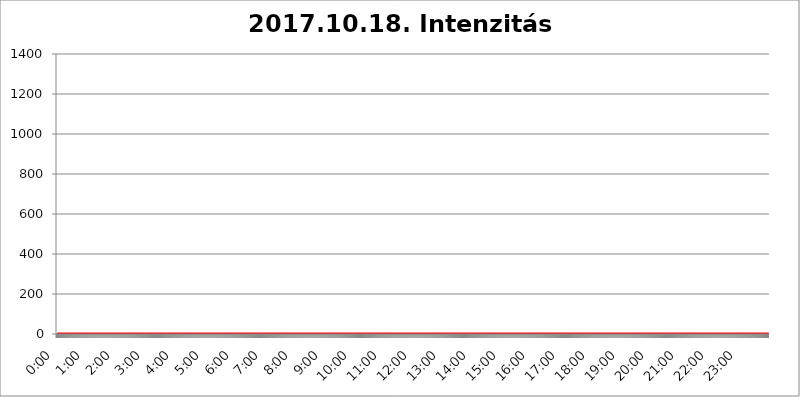
| Category | 2017.10.18. Intenzitás [W/m^2] |
|---|---|
| 0.0 | 0 |
| 0.0006944444444444445 | 0 |
| 0.001388888888888889 | 0 |
| 0.0020833333333333333 | 0 |
| 0.002777777777777778 | 0 |
| 0.003472222222222222 | 0 |
| 0.004166666666666667 | 0 |
| 0.004861111111111111 | 0 |
| 0.005555555555555556 | 0 |
| 0.0062499999999999995 | 0 |
| 0.006944444444444444 | 0 |
| 0.007638888888888889 | 0 |
| 0.008333333333333333 | 0 |
| 0.009027777777777779 | 0 |
| 0.009722222222222222 | 0 |
| 0.010416666666666666 | 0 |
| 0.011111111111111112 | 0 |
| 0.011805555555555555 | 0 |
| 0.012499999999999999 | 0 |
| 0.013194444444444444 | 0 |
| 0.013888888888888888 | 0 |
| 0.014583333333333332 | 0 |
| 0.015277777777777777 | 0 |
| 0.015972222222222224 | 0 |
| 0.016666666666666666 | 0 |
| 0.017361111111111112 | 0 |
| 0.018055555555555557 | 0 |
| 0.01875 | 0 |
| 0.019444444444444445 | 0 |
| 0.02013888888888889 | 0 |
| 0.020833333333333332 | 0 |
| 0.02152777777777778 | 0 |
| 0.022222222222222223 | 0 |
| 0.02291666666666667 | 0 |
| 0.02361111111111111 | 0 |
| 0.024305555555555556 | 0 |
| 0.024999999999999998 | 0 |
| 0.025694444444444447 | 0 |
| 0.02638888888888889 | 0 |
| 0.027083333333333334 | 0 |
| 0.027777777777777776 | 0 |
| 0.02847222222222222 | 0 |
| 0.029166666666666664 | 0 |
| 0.029861111111111113 | 0 |
| 0.030555555555555555 | 0 |
| 0.03125 | 0 |
| 0.03194444444444445 | 0 |
| 0.03263888888888889 | 0 |
| 0.03333333333333333 | 0 |
| 0.034027777777777775 | 0 |
| 0.034722222222222224 | 0 |
| 0.035416666666666666 | 0 |
| 0.036111111111111115 | 0 |
| 0.03680555555555556 | 0 |
| 0.0375 | 0 |
| 0.03819444444444444 | 0 |
| 0.03888888888888889 | 0 |
| 0.03958333333333333 | 0 |
| 0.04027777777777778 | 0 |
| 0.04097222222222222 | 0 |
| 0.041666666666666664 | 0 |
| 0.042361111111111106 | 0 |
| 0.04305555555555556 | 0 |
| 0.043750000000000004 | 0 |
| 0.044444444444444446 | 0 |
| 0.04513888888888889 | 0 |
| 0.04583333333333334 | 0 |
| 0.04652777777777778 | 0 |
| 0.04722222222222222 | 0 |
| 0.04791666666666666 | 0 |
| 0.04861111111111111 | 0 |
| 0.049305555555555554 | 0 |
| 0.049999999999999996 | 0 |
| 0.05069444444444445 | 0 |
| 0.051388888888888894 | 0 |
| 0.052083333333333336 | 0 |
| 0.05277777777777778 | 0 |
| 0.05347222222222222 | 0 |
| 0.05416666666666667 | 0 |
| 0.05486111111111111 | 0 |
| 0.05555555555555555 | 0 |
| 0.05625 | 0 |
| 0.05694444444444444 | 0 |
| 0.057638888888888885 | 0 |
| 0.05833333333333333 | 0 |
| 0.05902777777777778 | 0 |
| 0.059722222222222225 | 0 |
| 0.06041666666666667 | 0 |
| 0.061111111111111116 | 0 |
| 0.06180555555555556 | 0 |
| 0.0625 | 0 |
| 0.06319444444444444 | 0 |
| 0.06388888888888888 | 0 |
| 0.06458333333333334 | 0 |
| 0.06527777777777778 | 0 |
| 0.06597222222222222 | 0 |
| 0.06666666666666667 | 0 |
| 0.06736111111111111 | 0 |
| 0.06805555555555555 | 0 |
| 0.06874999999999999 | 0 |
| 0.06944444444444443 | 0 |
| 0.07013888888888889 | 0 |
| 0.07083333333333333 | 0 |
| 0.07152777777777779 | 0 |
| 0.07222222222222223 | 0 |
| 0.07291666666666667 | 0 |
| 0.07361111111111111 | 0 |
| 0.07430555555555556 | 0 |
| 0.075 | 0 |
| 0.07569444444444444 | 0 |
| 0.0763888888888889 | 0 |
| 0.07708333333333334 | 0 |
| 0.07777777777777778 | 0 |
| 0.07847222222222222 | 0 |
| 0.07916666666666666 | 0 |
| 0.0798611111111111 | 0 |
| 0.08055555555555556 | 0 |
| 0.08125 | 0 |
| 0.08194444444444444 | 0 |
| 0.08263888888888889 | 0 |
| 0.08333333333333333 | 0 |
| 0.08402777777777777 | 0 |
| 0.08472222222222221 | 0 |
| 0.08541666666666665 | 0 |
| 0.08611111111111112 | 0 |
| 0.08680555555555557 | 0 |
| 0.08750000000000001 | 0 |
| 0.08819444444444445 | 0 |
| 0.08888888888888889 | 0 |
| 0.08958333333333333 | 0 |
| 0.09027777777777778 | 0 |
| 0.09097222222222222 | 0 |
| 0.09166666666666667 | 0 |
| 0.09236111111111112 | 0 |
| 0.09305555555555556 | 0 |
| 0.09375 | 0 |
| 0.09444444444444444 | 0 |
| 0.09513888888888888 | 0 |
| 0.09583333333333333 | 0 |
| 0.09652777777777777 | 0 |
| 0.09722222222222222 | 0 |
| 0.09791666666666667 | 0 |
| 0.09861111111111111 | 0 |
| 0.09930555555555555 | 0 |
| 0.09999999999999999 | 0 |
| 0.10069444444444443 | 0 |
| 0.1013888888888889 | 0 |
| 0.10208333333333335 | 0 |
| 0.10277777777777779 | 0 |
| 0.10347222222222223 | 0 |
| 0.10416666666666667 | 0 |
| 0.10486111111111111 | 0 |
| 0.10555555555555556 | 0 |
| 0.10625 | 0 |
| 0.10694444444444444 | 0 |
| 0.1076388888888889 | 0 |
| 0.10833333333333334 | 0 |
| 0.10902777777777778 | 0 |
| 0.10972222222222222 | 0 |
| 0.1111111111111111 | 0 |
| 0.11180555555555556 | 0 |
| 0.11180555555555556 | 0 |
| 0.1125 | 0 |
| 0.11319444444444444 | 0 |
| 0.11388888888888889 | 0 |
| 0.11458333333333333 | 0 |
| 0.11527777777777777 | 0 |
| 0.11597222222222221 | 0 |
| 0.11666666666666665 | 0 |
| 0.1173611111111111 | 0 |
| 0.11805555555555557 | 0 |
| 0.11944444444444445 | 0 |
| 0.12013888888888889 | 0 |
| 0.12083333333333333 | 0 |
| 0.12152777777777778 | 0 |
| 0.12222222222222223 | 0 |
| 0.12291666666666667 | 0 |
| 0.12291666666666667 | 0 |
| 0.12361111111111112 | 0 |
| 0.12430555555555556 | 0 |
| 0.125 | 0 |
| 0.12569444444444444 | 0 |
| 0.12638888888888888 | 0 |
| 0.12708333333333333 | 0 |
| 0.16875 | 0 |
| 0.12847222222222224 | 0 |
| 0.12916666666666668 | 0 |
| 0.12986111111111112 | 0 |
| 0.13055555555555556 | 0 |
| 0.13125 | 0 |
| 0.13194444444444445 | 0 |
| 0.1326388888888889 | 0 |
| 0.13333333333333333 | 0 |
| 0.13402777777777777 | 0 |
| 0.13402777777777777 | 0 |
| 0.13472222222222222 | 0 |
| 0.13541666666666666 | 0 |
| 0.1361111111111111 | 0 |
| 0.13749999999999998 | 0 |
| 0.13819444444444443 | 0 |
| 0.1388888888888889 | 0 |
| 0.13958333333333334 | 0 |
| 0.14027777777777778 | 0 |
| 0.14097222222222222 | 0 |
| 0.14166666666666666 | 0 |
| 0.1423611111111111 | 0 |
| 0.14305555555555557 | 0 |
| 0.14375000000000002 | 0 |
| 0.14444444444444446 | 0 |
| 0.1451388888888889 | 0 |
| 0.1451388888888889 | 0 |
| 0.14652777777777778 | 0 |
| 0.14722222222222223 | 0 |
| 0.14791666666666667 | 0 |
| 0.1486111111111111 | 0 |
| 0.14930555555555555 | 0 |
| 0.15 | 0 |
| 0.15069444444444444 | 0 |
| 0.15138888888888888 | 0 |
| 0.15208333333333332 | 0 |
| 0.15277777777777776 | 0 |
| 0.15347222222222223 | 0 |
| 0.15416666666666667 | 0 |
| 0.15486111111111112 | 0 |
| 0.15555555555555556 | 0 |
| 0.15625 | 0 |
| 0.15694444444444444 | 0 |
| 0.15763888888888888 | 0 |
| 0.15833333333333333 | 0 |
| 0.15902777777777777 | 0 |
| 0.15972222222222224 | 0 |
| 0.16041666666666668 | 0 |
| 0.16111111111111112 | 0 |
| 0.16180555555555556 | 0 |
| 0.1625 | 0 |
| 0.16319444444444445 | 0 |
| 0.1638888888888889 | 0 |
| 0.16458333333333333 | 0 |
| 0.16527777777777777 | 0 |
| 0.16597222222222222 | 0 |
| 0.16666666666666666 | 0 |
| 0.1673611111111111 | 0 |
| 0.16805555555555554 | 0 |
| 0.16874999999999998 | 0 |
| 0.16944444444444443 | 0 |
| 0.17013888888888887 | 0 |
| 0.1708333333333333 | 0 |
| 0.17152777777777775 | 0 |
| 0.17222222222222225 | 0 |
| 0.1729166666666667 | 0 |
| 0.17361111111111113 | 0 |
| 0.17430555555555557 | 0 |
| 0.17500000000000002 | 0 |
| 0.17569444444444446 | 0 |
| 0.1763888888888889 | 0 |
| 0.17708333333333334 | 0 |
| 0.17777777777777778 | 0 |
| 0.17847222222222223 | 0 |
| 0.17916666666666667 | 0 |
| 0.1798611111111111 | 0 |
| 0.18055555555555555 | 0 |
| 0.18125 | 0 |
| 0.18194444444444444 | 0 |
| 0.1826388888888889 | 0 |
| 0.18333333333333335 | 0 |
| 0.1840277777777778 | 0 |
| 0.18472222222222223 | 0 |
| 0.18541666666666667 | 0 |
| 0.18611111111111112 | 0 |
| 0.18680555555555556 | 0 |
| 0.1875 | 0 |
| 0.18819444444444444 | 0 |
| 0.18888888888888888 | 0 |
| 0.18958333333333333 | 0 |
| 0.19027777777777777 | 0 |
| 0.1909722222222222 | 0 |
| 0.19166666666666665 | 0 |
| 0.19236111111111112 | 0 |
| 0.19305555555555554 | 0 |
| 0.19375 | 0 |
| 0.19444444444444445 | 0 |
| 0.1951388888888889 | 0 |
| 0.19583333333333333 | 0 |
| 0.19652777777777777 | 0 |
| 0.19722222222222222 | 0 |
| 0.19791666666666666 | 0 |
| 0.1986111111111111 | 0 |
| 0.19930555555555554 | 0 |
| 0.19999999999999998 | 0 |
| 0.20069444444444443 | 0 |
| 0.20138888888888887 | 0 |
| 0.2020833333333333 | 0 |
| 0.2027777777777778 | 0 |
| 0.2034722222222222 | 0 |
| 0.2041666666666667 | 0 |
| 0.20486111111111113 | 0 |
| 0.20555555555555557 | 0 |
| 0.20625000000000002 | 0 |
| 0.20694444444444446 | 0 |
| 0.2076388888888889 | 0 |
| 0.20833333333333334 | 0 |
| 0.20902777777777778 | 0 |
| 0.20972222222222223 | 0 |
| 0.21041666666666667 | 0 |
| 0.2111111111111111 | 0 |
| 0.21180555555555555 | 0 |
| 0.2125 | 0 |
| 0.21319444444444444 | 0 |
| 0.2138888888888889 | 0 |
| 0.21458333333333335 | 0 |
| 0.2152777777777778 | 0 |
| 0.21597222222222223 | 0 |
| 0.21666666666666667 | 0 |
| 0.21736111111111112 | 0 |
| 0.21805555555555556 | 0 |
| 0.21875 | 0 |
| 0.21944444444444444 | 0 |
| 0.22013888888888888 | 0 |
| 0.22083333333333333 | 0 |
| 0.22152777777777777 | 0 |
| 0.2222222222222222 | 0 |
| 0.22291666666666665 | 0 |
| 0.2236111111111111 | 0 |
| 0.22430555555555556 | 0 |
| 0.225 | 0 |
| 0.22569444444444445 | 0 |
| 0.2263888888888889 | 0 |
| 0.22708333333333333 | 0 |
| 0.22777777777777777 | 0 |
| 0.22847222222222222 | 0 |
| 0.22916666666666666 | 0 |
| 0.2298611111111111 | 0 |
| 0.23055555555555554 | 0 |
| 0.23124999999999998 | 0 |
| 0.23194444444444443 | 0 |
| 0.23263888888888887 | 0 |
| 0.2333333333333333 | 0 |
| 0.2340277777777778 | 0 |
| 0.2347222222222222 | 0 |
| 0.2354166666666667 | 0 |
| 0.23611111111111113 | 0 |
| 0.23680555555555557 | 0 |
| 0.23750000000000002 | 0 |
| 0.23819444444444446 | 0 |
| 0.2388888888888889 | 0 |
| 0.23958333333333334 | 0 |
| 0.24027777777777778 | 0 |
| 0.24097222222222223 | 0 |
| 0.24166666666666667 | 0 |
| 0.2423611111111111 | 0 |
| 0.24305555555555555 | 0 |
| 0.24375 | 0 |
| 0.24444444444444446 | 0 |
| 0.24513888888888888 | 0 |
| 0.24583333333333335 | 0 |
| 0.2465277777777778 | 0 |
| 0.24722222222222223 | 0 |
| 0.24791666666666667 | 0 |
| 0.24861111111111112 | 0 |
| 0.24930555555555556 | 0 |
| 0.25 | 0 |
| 0.25069444444444444 | 0 |
| 0.2513888888888889 | 0 |
| 0.2520833333333333 | 0 |
| 0.25277777777777777 | 0 |
| 0.2534722222222222 | 0 |
| 0.25416666666666665 | 0 |
| 0.2548611111111111 | 0 |
| 0.2555555555555556 | 0 |
| 0.25625000000000003 | 0 |
| 0.2569444444444445 | 0 |
| 0.2576388888888889 | 0 |
| 0.25833333333333336 | 0 |
| 0.2590277777777778 | 0 |
| 0.25972222222222224 | 0 |
| 0.2604166666666667 | 0 |
| 0.2611111111111111 | 0 |
| 0.26180555555555557 | 0 |
| 0.2625 | 0 |
| 0.26319444444444445 | 0 |
| 0.2638888888888889 | 0 |
| 0.26458333333333334 | 0 |
| 0.2652777777777778 | 0 |
| 0.2659722222222222 | 0 |
| 0.26666666666666666 | 0 |
| 0.2673611111111111 | 0 |
| 0.26805555555555555 | 0 |
| 0.26875 | 0 |
| 0.26944444444444443 | 0 |
| 0.2701388888888889 | 0 |
| 0.2708333333333333 | 0 |
| 0.27152777777777776 | 0 |
| 0.2722222222222222 | 0 |
| 0.27291666666666664 | 0 |
| 0.2736111111111111 | 0 |
| 0.2743055555555555 | 0 |
| 0.27499999999999997 | 0 |
| 0.27569444444444446 | 0 |
| 0.27638888888888885 | 0 |
| 0.27708333333333335 | 0 |
| 0.2777777777777778 | 0 |
| 0.27847222222222223 | 0 |
| 0.2791666666666667 | 0 |
| 0.2798611111111111 | 0 |
| 0.28055555555555556 | 0 |
| 0.28125 | 0 |
| 0.28194444444444444 | 0 |
| 0.2826388888888889 | 0 |
| 0.2833333333333333 | 0 |
| 0.28402777777777777 | 0 |
| 0.2847222222222222 | 0 |
| 0.28541666666666665 | 0 |
| 0.28611111111111115 | 0 |
| 0.28680555555555554 | 0 |
| 0.28750000000000003 | 0 |
| 0.2881944444444445 | 0 |
| 0.2888888888888889 | 0 |
| 0.28958333333333336 | 0 |
| 0.2902777777777778 | 0 |
| 0.29097222222222224 | 0 |
| 0.2916666666666667 | 0 |
| 0.2923611111111111 | 0 |
| 0.29305555555555557 | 0 |
| 0.29375 | 0 |
| 0.29444444444444445 | 0 |
| 0.2951388888888889 | 0 |
| 0.29583333333333334 | 0 |
| 0.2965277777777778 | 0 |
| 0.2972222222222222 | 0 |
| 0.29791666666666666 | 0 |
| 0.2986111111111111 | 0 |
| 0.29930555555555555 | 0 |
| 0.3 | 0 |
| 0.30069444444444443 | 0 |
| 0.3013888888888889 | 0 |
| 0.3020833333333333 | 0 |
| 0.30277777777777776 | 0 |
| 0.3034722222222222 | 0 |
| 0.30416666666666664 | 0 |
| 0.3048611111111111 | 0 |
| 0.3055555555555555 | 0 |
| 0.30624999999999997 | 0 |
| 0.3069444444444444 | 0 |
| 0.3076388888888889 | 0 |
| 0.30833333333333335 | 0 |
| 0.3090277777777778 | 0 |
| 0.30972222222222223 | 0 |
| 0.3104166666666667 | 0 |
| 0.3111111111111111 | 0 |
| 0.31180555555555556 | 0 |
| 0.3125 | 0 |
| 0.31319444444444444 | 0 |
| 0.3138888888888889 | 0 |
| 0.3145833333333333 | 0 |
| 0.31527777777777777 | 0 |
| 0.3159722222222222 | 0 |
| 0.31666666666666665 | 0 |
| 0.31736111111111115 | 0 |
| 0.31805555555555554 | 0 |
| 0.31875000000000003 | 0 |
| 0.3194444444444445 | 0 |
| 0.3201388888888889 | 0 |
| 0.32083333333333336 | 0 |
| 0.3215277777777778 | 0 |
| 0.32222222222222224 | 0 |
| 0.3229166666666667 | 0 |
| 0.3236111111111111 | 0 |
| 0.32430555555555557 | 0 |
| 0.325 | 0 |
| 0.32569444444444445 | 0 |
| 0.3263888888888889 | 0 |
| 0.32708333333333334 | 0 |
| 0.3277777777777778 | 0 |
| 0.3284722222222222 | 0 |
| 0.32916666666666666 | 0 |
| 0.3298611111111111 | 0 |
| 0.33055555555555555 | 0 |
| 0.33125 | 0 |
| 0.33194444444444443 | 0 |
| 0.3326388888888889 | 0 |
| 0.3333333333333333 | 0 |
| 0.3340277777777778 | 0 |
| 0.3347222222222222 | 0 |
| 0.3354166666666667 | 0 |
| 0.3361111111111111 | 0 |
| 0.3368055555555556 | 0 |
| 0.33749999999999997 | 0 |
| 0.33819444444444446 | 0 |
| 0.33888888888888885 | 0 |
| 0.33958333333333335 | 0 |
| 0.34027777777777773 | 0 |
| 0.34097222222222223 | 0 |
| 0.3416666666666666 | 0 |
| 0.3423611111111111 | 0 |
| 0.3430555555555555 | 0 |
| 0.34375 | 0 |
| 0.3444444444444445 | 0 |
| 0.3451388888888889 | 0 |
| 0.3458333333333334 | 0 |
| 0.34652777777777777 | 0 |
| 0.34722222222222227 | 0 |
| 0.34791666666666665 | 0 |
| 0.34861111111111115 | 0 |
| 0.34930555555555554 | 0 |
| 0.35000000000000003 | 0 |
| 0.3506944444444444 | 0 |
| 0.3513888888888889 | 0 |
| 0.3520833333333333 | 0 |
| 0.3527777777777778 | 0 |
| 0.3534722222222222 | 0 |
| 0.3541666666666667 | 0 |
| 0.3548611111111111 | 0 |
| 0.35555555555555557 | 0 |
| 0.35625 | 0 |
| 0.35694444444444445 | 0 |
| 0.3576388888888889 | 0 |
| 0.35833333333333334 | 0 |
| 0.3590277777777778 | 0 |
| 0.3597222222222222 | 0 |
| 0.36041666666666666 | 0 |
| 0.3611111111111111 | 0 |
| 0.36180555555555555 | 0 |
| 0.3625 | 0 |
| 0.36319444444444443 | 0 |
| 0.3638888888888889 | 0 |
| 0.3645833333333333 | 0 |
| 0.3652777777777778 | 0 |
| 0.3659722222222222 | 0 |
| 0.3666666666666667 | 0 |
| 0.3673611111111111 | 0 |
| 0.3680555555555556 | 0 |
| 0.36874999999999997 | 0 |
| 0.36944444444444446 | 0 |
| 0.37013888888888885 | 0 |
| 0.37083333333333335 | 0 |
| 0.37152777777777773 | 0 |
| 0.37222222222222223 | 0 |
| 0.3729166666666666 | 0 |
| 0.3736111111111111 | 0 |
| 0.3743055555555555 | 0 |
| 0.375 | 0 |
| 0.3756944444444445 | 0 |
| 0.3763888888888889 | 0 |
| 0.3770833333333334 | 0 |
| 0.37777777777777777 | 0 |
| 0.37847222222222227 | 0 |
| 0.37916666666666665 | 0 |
| 0.37986111111111115 | 0 |
| 0.38055555555555554 | 0 |
| 0.38125000000000003 | 0 |
| 0.3819444444444444 | 0 |
| 0.3826388888888889 | 0 |
| 0.3833333333333333 | 0 |
| 0.3840277777777778 | 0 |
| 0.3847222222222222 | 0 |
| 0.3854166666666667 | 0 |
| 0.3861111111111111 | 0 |
| 0.38680555555555557 | 0 |
| 0.3875 | 0 |
| 0.38819444444444445 | 0 |
| 0.3888888888888889 | 0 |
| 0.38958333333333334 | 0 |
| 0.3902777777777778 | 0 |
| 0.3909722222222222 | 0 |
| 0.39166666666666666 | 0 |
| 0.3923611111111111 | 0 |
| 0.39305555555555555 | 0 |
| 0.39375 | 0 |
| 0.39444444444444443 | 0 |
| 0.3951388888888889 | 0 |
| 0.3958333333333333 | 0 |
| 0.3965277777777778 | 0 |
| 0.3972222222222222 | 0 |
| 0.3979166666666667 | 0 |
| 0.3986111111111111 | 0 |
| 0.3993055555555556 | 0 |
| 0.39999999999999997 | 0 |
| 0.40069444444444446 | 0 |
| 0.40138888888888885 | 0 |
| 0.40208333333333335 | 0 |
| 0.40277777777777773 | 0 |
| 0.40347222222222223 | 0 |
| 0.4041666666666666 | 0 |
| 0.4048611111111111 | 0 |
| 0.4055555555555555 | 0 |
| 0.40625 | 0 |
| 0.4069444444444445 | 0 |
| 0.4076388888888889 | 0 |
| 0.4083333333333334 | 0 |
| 0.40902777777777777 | 0 |
| 0.40972222222222227 | 0 |
| 0.41041666666666665 | 0 |
| 0.41111111111111115 | 0 |
| 0.41180555555555554 | 0 |
| 0.41250000000000003 | 0 |
| 0.4131944444444444 | 0 |
| 0.4138888888888889 | 0 |
| 0.4145833333333333 | 0 |
| 0.4152777777777778 | 0 |
| 0.4159722222222222 | 0 |
| 0.4166666666666667 | 0 |
| 0.4173611111111111 | 0 |
| 0.41805555555555557 | 0 |
| 0.41875 | 0 |
| 0.41944444444444445 | 0 |
| 0.4201388888888889 | 0 |
| 0.42083333333333334 | 0 |
| 0.4215277777777778 | 0 |
| 0.4222222222222222 | 0 |
| 0.42291666666666666 | 0 |
| 0.4236111111111111 | 0 |
| 0.42430555555555555 | 0 |
| 0.425 | 0 |
| 0.42569444444444443 | 0 |
| 0.4263888888888889 | 0 |
| 0.4270833333333333 | 0 |
| 0.4277777777777778 | 0 |
| 0.4284722222222222 | 0 |
| 0.4291666666666667 | 0 |
| 0.4298611111111111 | 0 |
| 0.4305555555555556 | 0 |
| 0.43124999999999997 | 0 |
| 0.43194444444444446 | 0 |
| 0.43263888888888885 | 0 |
| 0.43333333333333335 | 0 |
| 0.43402777777777773 | 0 |
| 0.43472222222222223 | 0 |
| 0.4354166666666666 | 0 |
| 0.4361111111111111 | 0 |
| 0.4368055555555555 | 0 |
| 0.4375 | 0 |
| 0.4381944444444445 | 0 |
| 0.4388888888888889 | 0 |
| 0.4395833333333334 | 0 |
| 0.44027777777777777 | 0 |
| 0.44097222222222227 | 0 |
| 0.44166666666666665 | 0 |
| 0.44236111111111115 | 0 |
| 0.44305555555555554 | 0 |
| 0.44375000000000003 | 0 |
| 0.4444444444444444 | 0 |
| 0.4451388888888889 | 0 |
| 0.4458333333333333 | 0 |
| 0.4465277777777778 | 0 |
| 0.4472222222222222 | 0 |
| 0.4479166666666667 | 0 |
| 0.4486111111111111 | 0 |
| 0.44930555555555557 | 0 |
| 0.45 | 0 |
| 0.45069444444444445 | 0 |
| 0.4513888888888889 | 0 |
| 0.45208333333333334 | 0 |
| 0.4527777777777778 | 0 |
| 0.4534722222222222 | 0 |
| 0.45416666666666666 | 0 |
| 0.4548611111111111 | 0 |
| 0.45555555555555555 | 0 |
| 0.45625 | 0 |
| 0.45694444444444443 | 0 |
| 0.4576388888888889 | 0 |
| 0.4583333333333333 | 0 |
| 0.4590277777777778 | 0 |
| 0.4597222222222222 | 0 |
| 0.4604166666666667 | 0 |
| 0.4611111111111111 | 0 |
| 0.4618055555555556 | 0 |
| 0.46249999999999997 | 0 |
| 0.46319444444444446 | 0 |
| 0.46388888888888885 | 0 |
| 0.46458333333333335 | 0 |
| 0.46527777777777773 | 0 |
| 0.46597222222222223 | 0 |
| 0.4666666666666666 | 0 |
| 0.4673611111111111 | 0 |
| 0.4680555555555555 | 0 |
| 0.46875 | 0 |
| 0.4694444444444445 | 0 |
| 0.4701388888888889 | 0 |
| 0.4708333333333334 | 0 |
| 0.47152777777777777 | 0 |
| 0.47222222222222227 | 0 |
| 0.47291666666666665 | 0 |
| 0.47361111111111115 | 0 |
| 0.47430555555555554 | 0 |
| 0.47500000000000003 | 0 |
| 0.4756944444444444 | 0 |
| 0.4763888888888889 | 0 |
| 0.4770833333333333 | 0 |
| 0.4777777777777778 | 0 |
| 0.4784722222222222 | 0 |
| 0.4791666666666667 | 0 |
| 0.4798611111111111 | 0 |
| 0.48055555555555557 | 0 |
| 0.48125 | 0 |
| 0.48194444444444445 | 0 |
| 0.4826388888888889 | 0 |
| 0.48333333333333334 | 0 |
| 0.4840277777777778 | 0 |
| 0.4847222222222222 | 0 |
| 0.48541666666666666 | 0 |
| 0.4861111111111111 | 0 |
| 0.48680555555555555 | 0 |
| 0.4875 | 0 |
| 0.48819444444444443 | 0 |
| 0.4888888888888889 | 0 |
| 0.4895833333333333 | 0 |
| 0.4902777777777778 | 0 |
| 0.4909722222222222 | 0 |
| 0.4916666666666667 | 0 |
| 0.4923611111111111 | 0 |
| 0.4930555555555556 | 0 |
| 0.49374999999999997 | 0 |
| 0.49444444444444446 | 0 |
| 0.49513888888888885 | 0 |
| 0.49583333333333335 | 0 |
| 0.49652777777777773 | 0 |
| 0.49722222222222223 | 0 |
| 0.4979166666666666 | 0 |
| 0.4986111111111111 | 0 |
| 0.4993055555555555 | 0 |
| 0.5 | 0 |
| 0.5006944444444444 | 0 |
| 0.5013888888888889 | 0 |
| 0.5020833333333333 | 0 |
| 0.5027777777777778 | 0 |
| 0.5034722222222222 | 0 |
| 0.5041666666666667 | 0 |
| 0.5048611111111111 | 0 |
| 0.5055555555555555 | 0 |
| 0.50625 | 0 |
| 0.5069444444444444 | 0 |
| 0.5076388888888889 | 0 |
| 0.5083333333333333 | 0 |
| 0.5090277777777777 | 0 |
| 0.5097222222222222 | 0 |
| 0.5104166666666666 | 0 |
| 0.5111111111111112 | 0 |
| 0.5118055555555555 | 0 |
| 0.5125000000000001 | 0 |
| 0.5131944444444444 | 0 |
| 0.513888888888889 | 0 |
| 0.5145833333333333 | 0 |
| 0.5152777777777778 | 0 |
| 0.5159722222222222 | 0 |
| 0.5166666666666667 | 0 |
| 0.517361111111111 | 0 |
| 0.5180555555555556 | 0 |
| 0.5187499999999999 | 0 |
| 0.5194444444444445 | 0 |
| 0.5201388888888888 | 0 |
| 0.5208333333333334 | 0 |
| 0.5215277777777778 | 0 |
| 0.5222222222222223 | 0 |
| 0.5229166666666667 | 0 |
| 0.5236111111111111 | 0 |
| 0.5243055555555556 | 0 |
| 0.525 | 0 |
| 0.5256944444444445 | 0 |
| 0.5263888888888889 | 0 |
| 0.5270833333333333 | 0 |
| 0.5277777777777778 | 0 |
| 0.5284722222222222 | 0 |
| 0.5291666666666667 | 0 |
| 0.5298611111111111 | 0 |
| 0.5305555555555556 | 0 |
| 0.53125 | 0 |
| 0.5319444444444444 | 0 |
| 0.5326388888888889 | 0 |
| 0.5333333333333333 | 0 |
| 0.5340277777777778 | 0 |
| 0.5347222222222222 | 0 |
| 0.5354166666666667 | 0 |
| 0.5361111111111111 | 0 |
| 0.5368055555555555 | 0 |
| 0.5375 | 0 |
| 0.5381944444444444 | 0 |
| 0.5388888888888889 | 0 |
| 0.5395833333333333 | 0 |
| 0.5402777777777777 | 0 |
| 0.5409722222222222 | 0 |
| 0.5416666666666666 | 0 |
| 0.5423611111111112 | 0 |
| 0.5430555555555555 | 0 |
| 0.5437500000000001 | 0 |
| 0.5444444444444444 | 0 |
| 0.545138888888889 | 0 |
| 0.5458333333333333 | 0 |
| 0.5465277777777778 | 0 |
| 0.5472222222222222 | 0 |
| 0.5479166666666667 | 0 |
| 0.548611111111111 | 0 |
| 0.5493055555555556 | 0 |
| 0.5499999999999999 | 0 |
| 0.5506944444444445 | 0 |
| 0.5513888888888888 | 0 |
| 0.5520833333333334 | 0 |
| 0.5527777777777778 | 0 |
| 0.5534722222222223 | 0 |
| 0.5541666666666667 | 0 |
| 0.5548611111111111 | 0 |
| 0.5555555555555556 | 0 |
| 0.55625 | 0 |
| 0.5569444444444445 | 0 |
| 0.5576388888888889 | 0 |
| 0.5583333333333333 | 0 |
| 0.5590277777777778 | 0 |
| 0.5597222222222222 | 0 |
| 0.5604166666666667 | 0 |
| 0.5611111111111111 | 0 |
| 0.5618055555555556 | 0 |
| 0.5625 | 0 |
| 0.5631944444444444 | 0 |
| 0.5638888888888889 | 0 |
| 0.5645833333333333 | 0 |
| 0.5652777777777778 | 0 |
| 0.5659722222222222 | 0 |
| 0.5666666666666667 | 0 |
| 0.5673611111111111 | 0 |
| 0.5680555555555555 | 0 |
| 0.56875 | 0 |
| 0.5694444444444444 | 0 |
| 0.5701388888888889 | 0 |
| 0.5708333333333333 | 0 |
| 0.5715277777777777 | 0 |
| 0.5722222222222222 | 0 |
| 0.5729166666666666 | 0 |
| 0.5736111111111112 | 0 |
| 0.5743055555555555 | 0 |
| 0.5750000000000001 | 0 |
| 0.5756944444444444 | 0 |
| 0.576388888888889 | 0 |
| 0.5770833333333333 | 0 |
| 0.5777777777777778 | 0 |
| 0.5784722222222222 | 0 |
| 0.5791666666666667 | 0 |
| 0.579861111111111 | 0 |
| 0.5805555555555556 | 0 |
| 0.5812499999999999 | 0 |
| 0.5819444444444445 | 0 |
| 0.5826388888888888 | 0 |
| 0.5833333333333334 | 0 |
| 0.5840277777777778 | 0 |
| 0.5847222222222223 | 0 |
| 0.5854166666666667 | 0 |
| 0.5861111111111111 | 0 |
| 0.5868055555555556 | 0 |
| 0.5875 | 0 |
| 0.5881944444444445 | 0 |
| 0.5888888888888889 | 0 |
| 0.5895833333333333 | 0 |
| 0.5902777777777778 | 0 |
| 0.5909722222222222 | 0 |
| 0.5916666666666667 | 0 |
| 0.5923611111111111 | 0 |
| 0.5930555555555556 | 0 |
| 0.59375 | 0 |
| 0.5944444444444444 | 0 |
| 0.5951388888888889 | 0 |
| 0.5958333333333333 | 0 |
| 0.5965277777777778 | 0 |
| 0.5972222222222222 | 0 |
| 0.5979166666666667 | 0 |
| 0.5986111111111111 | 0 |
| 0.5993055555555555 | 0 |
| 0.6 | 0 |
| 0.6006944444444444 | 0 |
| 0.6013888888888889 | 0 |
| 0.6020833333333333 | 0 |
| 0.6027777777777777 | 0 |
| 0.6034722222222222 | 0 |
| 0.6041666666666666 | 0 |
| 0.6048611111111112 | 0 |
| 0.6055555555555555 | 0 |
| 0.6062500000000001 | 0 |
| 0.6069444444444444 | 0 |
| 0.607638888888889 | 0 |
| 0.6083333333333333 | 0 |
| 0.6090277777777778 | 0 |
| 0.6097222222222222 | 0 |
| 0.6104166666666667 | 0 |
| 0.611111111111111 | 0 |
| 0.6118055555555556 | 0 |
| 0.6124999999999999 | 0 |
| 0.6131944444444445 | 0 |
| 0.6138888888888888 | 0 |
| 0.6145833333333334 | 0 |
| 0.6152777777777778 | 0 |
| 0.6159722222222223 | 0 |
| 0.6166666666666667 | 0 |
| 0.6173611111111111 | 0 |
| 0.6180555555555556 | 0 |
| 0.61875 | 0 |
| 0.6194444444444445 | 0 |
| 0.6201388888888889 | 0 |
| 0.6208333333333333 | 0 |
| 0.6215277777777778 | 0 |
| 0.6222222222222222 | 0 |
| 0.6229166666666667 | 0 |
| 0.6236111111111111 | 0 |
| 0.6243055555555556 | 0 |
| 0.625 | 0 |
| 0.6256944444444444 | 0 |
| 0.6263888888888889 | 0 |
| 0.6270833333333333 | 0 |
| 0.6277777777777778 | 0 |
| 0.6284722222222222 | 0 |
| 0.6291666666666667 | 0 |
| 0.6298611111111111 | 0 |
| 0.6305555555555555 | 0 |
| 0.63125 | 0 |
| 0.6319444444444444 | 0 |
| 0.6326388888888889 | 0 |
| 0.6333333333333333 | 0 |
| 0.6340277777777777 | 0 |
| 0.6347222222222222 | 0 |
| 0.6354166666666666 | 0 |
| 0.6361111111111112 | 0 |
| 0.6368055555555555 | 0 |
| 0.6375000000000001 | 0 |
| 0.6381944444444444 | 0 |
| 0.638888888888889 | 0 |
| 0.6395833333333333 | 0 |
| 0.6402777777777778 | 0 |
| 0.6409722222222222 | 0 |
| 0.6416666666666667 | 0 |
| 0.642361111111111 | 0 |
| 0.6430555555555556 | 0 |
| 0.6437499999999999 | 0 |
| 0.6444444444444445 | 0 |
| 0.6451388888888888 | 0 |
| 0.6458333333333334 | 0 |
| 0.6465277777777778 | 0 |
| 0.6472222222222223 | 0 |
| 0.6479166666666667 | 0 |
| 0.6486111111111111 | 0 |
| 0.6493055555555556 | 0 |
| 0.65 | 0 |
| 0.6506944444444445 | 0 |
| 0.6513888888888889 | 0 |
| 0.6520833333333333 | 0 |
| 0.6527777777777778 | 0 |
| 0.6534722222222222 | 0 |
| 0.6541666666666667 | 0 |
| 0.6548611111111111 | 0 |
| 0.6555555555555556 | 0 |
| 0.65625 | 0 |
| 0.6569444444444444 | 0 |
| 0.6576388888888889 | 0 |
| 0.6583333333333333 | 0 |
| 0.6590277777777778 | 0 |
| 0.6597222222222222 | 0 |
| 0.6604166666666667 | 0 |
| 0.6611111111111111 | 0 |
| 0.6618055555555555 | 0 |
| 0.6625 | 0 |
| 0.6631944444444444 | 0 |
| 0.6638888888888889 | 0 |
| 0.6645833333333333 | 0 |
| 0.6652777777777777 | 0 |
| 0.6659722222222222 | 0 |
| 0.6666666666666666 | 0 |
| 0.6673611111111111 | 0 |
| 0.6680555555555556 | 0 |
| 0.6687500000000001 | 0 |
| 0.6694444444444444 | 0 |
| 0.6701388888888888 | 0 |
| 0.6708333333333334 | 0 |
| 0.6715277777777778 | 0 |
| 0.6722222222222222 | 0 |
| 0.6729166666666666 | 0 |
| 0.6736111111111112 | 0 |
| 0.6743055555555556 | 0 |
| 0.6749999999999999 | 0 |
| 0.6756944444444444 | 0 |
| 0.6763888888888889 | 0 |
| 0.6770833333333334 | 0 |
| 0.6777777777777777 | 0 |
| 0.6784722222222223 | 0 |
| 0.6791666666666667 | 0 |
| 0.6798611111111111 | 0 |
| 0.6805555555555555 | 0 |
| 0.68125 | 0 |
| 0.6819444444444445 | 0 |
| 0.6826388888888889 | 0 |
| 0.6833333333333332 | 0 |
| 0.6840277777777778 | 0 |
| 0.6847222222222222 | 0 |
| 0.6854166666666667 | 0 |
| 0.686111111111111 | 0 |
| 0.6868055555555556 | 0 |
| 0.6875 | 0 |
| 0.6881944444444444 | 0 |
| 0.688888888888889 | 0 |
| 0.6895833333333333 | 0 |
| 0.6902777777777778 | 0 |
| 0.6909722222222222 | 0 |
| 0.6916666666666668 | 0 |
| 0.6923611111111111 | 0 |
| 0.6930555555555555 | 0 |
| 0.69375 | 0 |
| 0.6944444444444445 | 0 |
| 0.6951388888888889 | 0 |
| 0.6958333333333333 | 0 |
| 0.6965277777777777 | 0 |
| 0.6972222222222223 | 0 |
| 0.6979166666666666 | 0 |
| 0.6986111111111111 | 0 |
| 0.6993055555555556 | 0 |
| 0.7000000000000001 | 0 |
| 0.7006944444444444 | 0 |
| 0.7013888888888888 | 0 |
| 0.7020833333333334 | 0 |
| 0.7027777777777778 | 0 |
| 0.7034722222222222 | 0 |
| 0.7041666666666666 | 0 |
| 0.7048611111111112 | 0 |
| 0.7055555555555556 | 0 |
| 0.7062499999999999 | 0 |
| 0.7069444444444444 | 0 |
| 0.7076388888888889 | 0 |
| 0.7083333333333334 | 0 |
| 0.7090277777777777 | 0 |
| 0.7097222222222223 | 0 |
| 0.7104166666666667 | 0 |
| 0.7111111111111111 | 0 |
| 0.7118055555555555 | 0 |
| 0.7125 | 0 |
| 0.7131944444444445 | 0 |
| 0.7138888888888889 | 0 |
| 0.7145833333333332 | 0 |
| 0.7152777777777778 | 0 |
| 0.7159722222222222 | 0 |
| 0.7166666666666667 | 0 |
| 0.717361111111111 | 0 |
| 0.7180555555555556 | 0 |
| 0.71875 | 0 |
| 0.7194444444444444 | 0 |
| 0.720138888888889 | 0 |
| 0.7208333333333333 | 0 |
| 0.7215277777777778 | 0 |
| 0.7222222222222222 | 0 |
| 0.7229166666666668 | 0 |
| 0.7236111111111111 | 0 |
| 0.7243055555555555 | 0 |
| 0.725 | 0 |
| 0.7256944444444445 | 0 |
| 0.7263888888888889 | 0 |
| 0.7270833333333333 | 0 |
| 0.7277777777777777 | 0 |
| 0.7284722222222223 | 0 |
| 0.7291666666666666 | 0 |
| 0.7298611111111111 | 0 |
| 0.7305555555555556 | 0 |
| 0.7312500000000001 | 0 |
| 0.7319444444444444 | 0 |
| 0.7326388888888888 | 0 |
| 0.7333333333333334 | 0 |
| 0.7340277777777778 | 0 |
| 0.7347222222222222 | 0 |
| 0.7354166666666666 | 0 |
| 0.7361111111111112 | 0 |
| 0.7368055555555556 | 0 |
| 0.7374999999999999 | 0 |
| 0.7381944444444444 | 0 |
| 0.7388888888888889 | 0 |
| 0.7395833333333334 | 0 |
| 0.7402777777777777 | 0 |
| 0.7409722222222223 | 0 |
| 0.7416666666666667 | 0 |
| 0.7423611111111111 | 0 |
| 0.7430555555555555 | 0 |
| 0.74375 | 0 |
| 0.7444444444444445 | 0 |
| 0.7451388888888889 | 0 |
| 0.7458333333333332 | 0 |
| 0.7465277777777778 | 0 |
| 0.7472222222222222 | 0 |
| 0.7479166666666667 | 0 |
| 0.748611111111111 | 0 |
| 0.7493055555555556 | 0 |
| 0.75 | 0 |
| 0.7506944444444444 | 0 |
| 0.751388888888889 | 0 |
| 0.7520833333333333 | 0 |
| 0.7527777777777778 | 0 |
| 0.7534722222222222 | 0 |
| 0.7541666666666668 | 0 |
| 0.7548611111111111 | 0 |
| 0.7555555555555555 | 0 |
| 0.75625 | 0 |
| 0.7569444444444445 | 0 |
| 0.7576388888888889 | 0 |
| 0.7583333333333333 | 0 |
| 0.7590277777777777 | 0 |
| 0.7597222222222223 | 0 |
| 0.7604166666666666 | 0 |
| 0.7611111111111111 | 0 |
| 0.7618055555555556 | 0 |
| 0.7625000000000001 | 0 |
| 0.7631944444444444 | 0 |
| 0.7638888888888888 | 0 |
| 0.7645833333333334 | 0 |
| 0.7652777777777778 | 0 |
| 0.7659722222222222 | 0 |
| 0.7666666666666666 | 0 |
| 0.7673611111111112 | 0 |
| 0.7680555555555556 | 0 |
| 0.7687499999999999 | 0 |
| 0.7694444444444444 | 0 |
| 0.7701388888888889 | 0 |
| 0.7708333333333334 | 0 |
| 0.7715277777777777 | 0 |
| 0.7722222222222223 | 0 |
| 0.7729166666666667 | 0 |
| 0.7736111111111111 | 0 |
| 0.7743055555555555 | 0 |
| 0.775 | 0 |
| 0.7756944444444445 | 0 |
| 0.7763888888888889 | 0 |
| 0.7770833333333332 | 0 |
| 0.7777777777777778 | 0 |
| 0.7784722222222222 | 0 |
| 0.7791666666666667 | 0 |
| 0.779861111111111 | 0 |
| 0.7805555555555556 | 0 |
| 0.78125 | 0 |
| 0.7819444444444444 | 0 |
| 0.782638888888889 | 0 |
| 0.7833333333333333 | 0 |
| 0.7840277777777778 | 0 |
| 0.7847222222222222 | 0 |
| 0.7854166666666668 | 0 |
| 0.7861111111111111 | 0 |
| 0.7868055555555555 | 0 |
| 0.7875 | 0 |
| 0.7881944444444445 | 0 |
| 0.7888888888888889 | 0 |
| 0.7895833333333333 | 0 |
| 0.7902777777777777 | 0 |
| 0.7909722222222223 | 0 |
| 0.7916666666666666 | 0 |
| 0.7923611111111111 | 0 |
| 0.7930555555555556 | 0 |
| 0.7937500000000001 | 0 |
| 0.7944444444444444 | 0 |
| 0.7951388888888888 | 0 |
| 0.7958333333333334 | 0 |
| 0.7965277777777778 | 0 |
| 0.7972222222222222 | 0 |
| 0.7979166666666666 | 0 |
| 0.7986111111111112 | 0 |
| 0.7993055555555556 | 0 |
| 0.7999999999999999 | 0 |
| 0.8006944444444444 | 0 |
| 0.8013888888888889 | 0 |
| 0.8020833333333334 | 0 |
| 0.8027777777777777 | 0 |
| 0.8034722222222223 | 0 |
| 0.8041666666666667 | 0 |
| 0.8048611111111111 | 0 |
| 0.8055555555555555 | 0 |
| 0.80625 | 0 |
| 0.8069444444444445 | 0 |
| 0.8076388888888889 | 0 |
| 0.8083333333333332 | 0 |
| 0.8090277777777778 | 0 |
| 0.8097222222222222 | 0 |
| 0.8104166666666667 | 0 |
| 0.811111111111111 | 0 |
| 0.8118055555555556 | 0 |
| 0.8125 | 0 |
| 0.8131944444444444 | 0 |
| 0.813888888888889 | 0 |
| 0.8145833333333333 | 0 |
| 0.8152777777777778 | 0 |
| 0.8159722222222222 | 0 |
| 0.8166666666666668 | 0 |
| 0.8173611111111111 | 0 |
| 0.8180555555555555 | 0 |
| 0.81875 | 0 |
| 0.8194444444444445 | 0 |
| 0.8201388888888889 | 0 |
| 0.8208333333333333 | 0 |
| 0.8215277777777777 | 0 |
| 0.8222222222222223 | 0 |
| 0.8229166666666666 | 0 |
| 0.8236111111111111 | 0 |
| 0.8243055555555556 | 0 |
| 0.8250000000000001 | 0 |
| 0.8256944444444444 | 0 |
| 0.8263888888888888 | 0 |
| 0.8270833333333334 | 0 |
| 0.8277777777777778 | 0 |
| 0.8284722222222222 | 0 |
| 0.8291666666666666 | 0 |
| 0.8298611111111112 | 0 |
| 0.8305555555555556 | 0 |
| 0.8312499999999999 | 0 |
| 0.8319444444444444 | 0 |
| 0.8326388888888889 | 0 |
| 0.8333333333333334 | 0 |
| 0.8340277777777777 | 0 |
| 0.8347222222222223 | 0 |
| 0.8354166666666667 | 0 |
| 0.8361111111111111 | 0 |
| 0.8368055555555555 | 0 |
| 0.8375 | 0 |
| 0.8381944444444445 | 0 |
| 0.8388888888888889 | 0 |
| 0.8395833333333332 | 0 |
| 0.8402777777777778 | 0 |
| 0.8409722222222222 | 0 |
| 0.8416666666666667 | 0 |
| 0.842361111111111 | 0 |
| 0.8430555555555556 | 0 |
| 0.84375 | 0 |
| 0.8444444444444444 | 0 |
| 0.845138888888889 | 0 |
| 0.8458333333333333 | 0 |
| 0.8465277777777778 | 0 |
| 0.8472222222222222 | 0 |
| 0.8479166666666668 | 0 |
| 0.8486111111111111 | 0 |
| 0.8493055555555555 | 0 |
| 0.85 | 0 |
| 0.8506944444444445 | 0 |
| 0.8513888888888889 | 0 |
| 0.8520833333333333 | 0 |
| 0.8527777777777777 | 0 |
| 0.8534722222222223 | 0 |
| 0.8541666666666666 | 0 |
| 0.8548611111111111 | 0 |
| 0.8555555555555556 | 0 |
| 0.8562500000000001 | 0 |
| 0.8569444444444444 | 0 |
| 0.8576388888888888 | 0 |
| 0.8583333333333334 | 0 |
| 0.8590277777777778 | 0 |
| 0.8597222222222222 | 0 |
| 0.8604166666666666 | 0 |
| 0.8611111111111112 | 0 |
| 0.8618055555555556 | 0 |
| 0.8624999999999999 | 0 |
| 0.8631944444444444 | 0 |
| 0.8638888888888889 | 0 |
| 0.8645833333333334 | 0 |
| 0.8652777777777777 | 0 |
| 0.8659722222222223 | 0 |
| 0.8666666666666667 | 0 |
| 0.8673611111111111 | 0 |
| 0.8680555555555555 | 0 |
| 0.86875 | 0 |
| 0.8694444444444445 | 0 |
| 0.8701388888888889 | 0 |
| 0.8708333333333332 | 0 |
| 0.8715277777777778 | 0 |
| 0.8722222222222222 | 0 |
| 0.8729166666666667 | 0 |
| 0.873611111111111 | 0 |
| 0.8743055555555556 | 0 |
| 0.875 | 0 |
| 0.8756944444444444 | 0 |
| 0.876388888888889 | 0 |
| 0.8770833333333333 | 0 |
| 0.8777777777777778 | 0 |
| 0.8784722222222222 | 0 |
| 0.8791666666666668 | 0 |
| 0.8798611111111111 | 0 |
| 0.8805555555555555 | 0 |
| 0.88125 | 0 |
| 0.8819444444444445 | 0 |
| 0.8826388888888889 | 0 |
| 0.8833333333333333 | 0 |
| 0.8840277777777777 | 0 |
| 0.8847222222222223 | 0 |
| 0.8854166666666666 | 0 |
| 0.8861111111111111 | 0 |
| 0.8868055555555556 | 0 |
| 0.8875000000000001 | 0 |
| 0.8881944444444444 | 0 |
| 0.8888888888888888 | 0 |
| 0.8895833333333334 | 0 |
| 0.8902777777777778 | 0 |
| 0.8909722222222222 | 0 |
| 0.8916666666666666 | 0 |
| 0.8923611111111112 | 0 |
| 0.8930555555555556 | 0 |
| 0.8937499999999999 | 0 |
| 0.8944444444444444 | 0 |
| 0.8951388888888889 | 0 |
| 0.8958333333333334 | 0 |
| 0.8965277777777777 | 0 |
| 0.8972222222222223 | 0 |
| 0.8979166666666667 | 0 |
| 0.8986111111111111 | 0 |
| 0.8993055555555555 | 0 |
| 0.9 | 0 |
| 0.9006944444444445 | 0 |
| 0.9013888888888889 | 0 |
| 0.9020833333333332 | 0 |
| 0.9027777777777778 | 0 |
| 0.9034722222222222 | 0 |
| 0.9041666666666667 | 0 |
| 0.904861111111111 | 0 |
| 0.9055555555555556 | 0 |
| 0.90625 | 0 |
| 0.9069444444444444 | 0 |
| 0.907638888888889 | 0 |
| 0.9083333333333333 | 0 |
| 0.9090277777777778 | 0 |
| 0.9097222222222222 | 0 |
| 0.9104166666666668 | 0 |
| 0.9111111111111111 | 0 |
| 0.9118055555555555 | 0 |
| 0.9125 | 0 |
| 0.9131944444444445 | 0 |
| 0.9138888888888889 | 0 |
| 0.9145833333333333 | 0 |
| 0.9152777777777777 | 0 |
| 0.9159722222222223 | 0 |
| 0.9166666666666666 | 0 |
| 0.9173611111111111 | 0 |
| 0.9180555555555556 | 0 |
| 0.9187500000000001 | 0 |
| 0.9194444444444444 | 0 |
| 0.9201388888888888 | 0 |
| 0.9208333333333334 | 0 |
| 0.9215277777777778 | 0 |
| 0.9222222222222222 | 0 |
| 0.9229166666666666 | 0 |
| 0.9236111111111112 | 0 |
| 0.9243055555555556 | 0 |
| 0.9249999999999999 | 0 |
| 0.9256944444444444 | 0 |
| 0.9263888888888889 | 0 |
| 0.9270833333333334 | 0 |
| 0.9277777777777777 | 0 |
| 0.9284722222222223 | 0 |
| 0.9291666666666667 | 0 |
| 0.9298611111111111 | 0 |
| 0.9305555555555555 | 0 |
| 0.93125 | 0 |
| 0.9319444444444445 | 0 |
| 0.9326388888888889 | 0 |
| 0.9333333333333332 | 0 |
| 0.9340277777777778 | 0 |
| 0.9347222222222222 | 0 |
| 0.9354166666666667 | 0 |
| 0.936111111111111 | 0 |
| 0.9368055555555556 | 0 |
| 0.9375 | 0 |
| 0.9381944444444444 | 0 |
| 0.938888888888889 | 0 |
| 0.9395833333333333 | 0 |
| 0.9402777777777778 | 0 |
| 0.9409722222222222 | 0 |
| 0.9416666666666668 | 0 |
| 0.9423611111111111 | 0 |
| 0.9430555555555555 | 0 |
| 0.94375 | 0 |
| 0.9444444444444445 | 0 |
| 0.9451388888888889 | 0 |
| 0.9458333333333333 | 0 |
| 0.9465277777777777 | 0 |
| 0.9472222222222223 | 0 |
| 0.9479166666666666 | 0 |
| 0.9486111111111111 | 0 |
| 0.9493055555555556 | 0 |
| 0.9500000000000001 | 0 |
| 0.9506944444444444 | 0 |
| 0.9513888888888888 | 0 |
| 0.9520833333333334 | 0 |
| 0.9527777777777778 | 0 |
| 0.9534722222222222 | 0 |
| 0.9541666666666666 | 0 |
| 0.9548611111111112 | 0 |
| 0.9555555555555556 | 0 |
| 0.9562499999999999 | 0 |
| 0.9569444444444444 | 0 |
| 0.9576388888888889 | 0 |
| 0.9583333333333334 | 0 |
| 0.9590277777777777 | 0 |
| 0.9597222222222223 | 0 |
| 0.9604166666666667 | 0 |
| 0.9611111111111111 | 0 |
| 0.9618055555555555 | 0 |
| 0.9625 | 0 |
| 0.9631944444444445 | 0 |
| 0.9638888888888889 | 0 |
| 0.9645833333333332 | 0 |
| 0.9652777777777778 | 0 |
| 0.9659722222222222 | 0 |
| 0.9666666666666667 | 0 |
| 0.967361111111111 | 0 |
| 0.9680555555555556 | 0 |
| 0.96875 | 0 |
| 0.9694444444444444 | 0 |
| 0.970138888888889 | 0 |
| 0.9708333333333333 | 0 |
| 0.9715277777777778 | 0 |
| 0.9722222222222222 | 0 |
| 0.9729166666666668 | 0 |
| 0.9736111111111111 | 0 |
| 0.9743055555555555 | 0 |
| 0.975 | 0 |
| 0.9756944444444445 | 0 |
| 0.9763888888888889 | 0 |
| 0.9770833333333333 | 0 |
| 0.9777777777777777 | 0 |
| 0.9784722222222223 | 0 |
| 0.9791666666666666 | 0 |
| 0.9798611111111111 | 0 |
| 0.9805555555555556 | 0 |
| 0.9812500000000001 | 0 |
| 0.9819444444444444 | 0 |
| 0.9826388888888888 | 0 |
| 0.9833333333333334 | 0 |
| 0.9840277777777778 | 0 |
| 0.9847222222222222 | 0 |
| 0.9854166666666666 | 0 |
| 0.9861111111111112 | 0 |
| 0.9868055555555556 | 0 |
| 0.9874999999999999 | 0 |
| 0.9881944444444444 | 0 |
| 0.9888888888888889 | 0 |
| 0.9895833333333334 | 0 |
| 0.9902777777777777 | 0 |
| 0.9909722222222223 | 0 |
| 0.9916666666666667 | 0 |
| 0.9923611111111111 | 0 |
| 0.9930555555555555 | 0 |
| 0.99375 | 0 |
| 0.9944444444444445 | 0 |
| 0.9951388888888889 | 0 |
| 0.9958333333333332 | 0 |
| 0.9965277777777778 | 0 |
| 0.9972222222222222 | 0 |
| 0.9979166666666667 | 0 |
| 0.998611111111111 | 0 |
| 0.9993055555555556 | 0 |